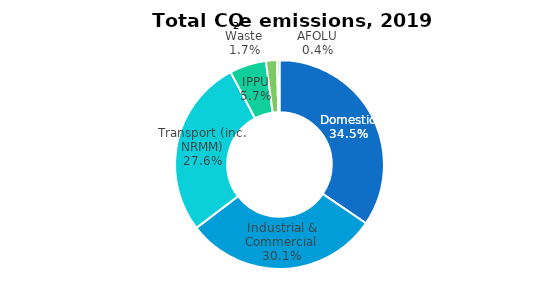
| Category | Series 0 |
|---|---|
| Domestic | 10.825 |
| Industrial & Commercial | 9.454 |
| Transport (inc. NRMM) | 8.668 |
| IPPU | 1.779 |
| Waste | 0.533 |
| AFOLU | 0.119 |